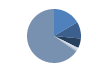
| Category | Series 0 |
|---|---|
| ARRASTRE | 109 |
| CERCO | 66 |
| PALANGRE | 38 |
| REDES DE ENMALLE | 10 |
| ARTES FIJAS | 6 |
| ARTES MENORES | 431 |